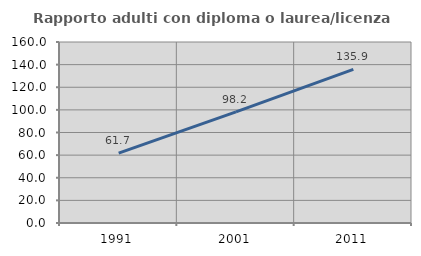
| Category | Rapporto adulti con diploma o laurea/licenza media  |
|---|---|
| 1991.0 | 61.73 |
| 2001.0 | 98.235 |
| 2011.0 | 135.852 |